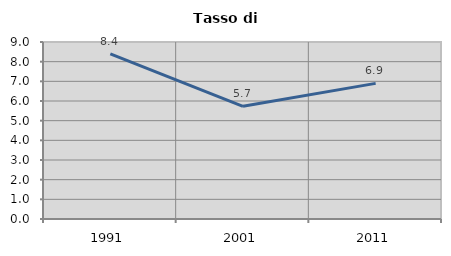
| Category | Tasso di disoccupazione   |
|---|---|
| 1991.0 | 8.4 |
| 2001.0 | 5.728 |
| 2011.0 | 6.897 |